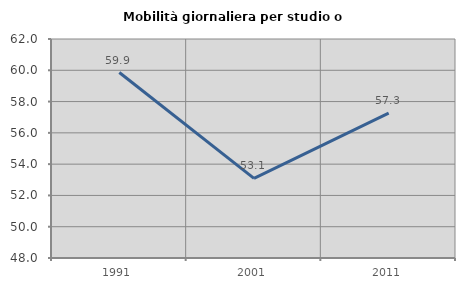
| Category | Mobilità giornaliera per studio o lavoro |
|---|---|
| 1991.0 | 59.856 |
| 2001.0 | 53.088 |
| 2011.0 | 57.257 |